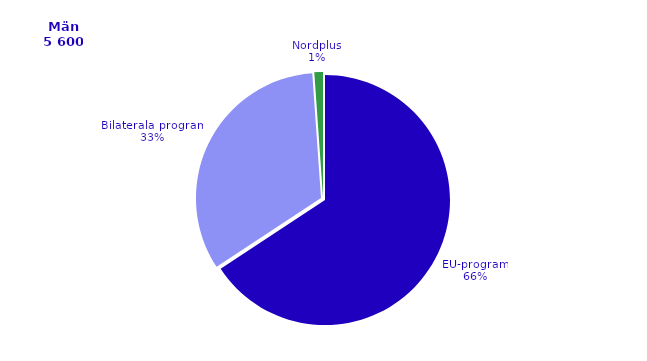
| Category | Series 0 |
|---|---|
| EU-program | 3660 |
| Bilaterala program | 1847 |
| Nordplus | 62 |